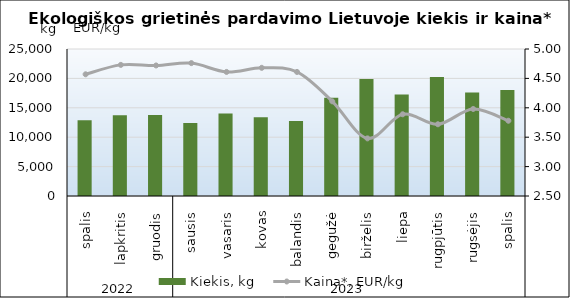
| Category | Kiekis, kg |
|---|---|
| 0 | 12872 |
| 1 | 13732 |
| 2 | 13776 |
| 3 | 12422 |
| 4 | 14033 |
| 5 | 13401 |
| 6 | 12742 |
| 7 | 16697 |
| 8 | 19904 |
| 9 | 17251 |
| 10 | 20226 |
| 11 | 17607 |
| 12 | 18024 |